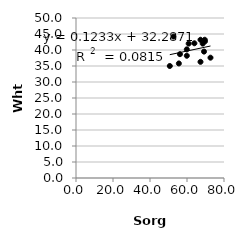
| Category | Series 0 |
|---|---|
| 59.9 | 38.2 |
| 72.7 | 37.6 |
| 55.6 | 35.8 |
| 67.3 | 36.3 |
| 69.2 | 39.5 |
| 67.3 | 43.2 |
| 69.7 | 42.7 |
| 60.9 | 42 |
| 59.9 | 40.2 |
| 50.7 | 35 |
| 52.7 | 44.2 |
| 69.6 | 43.2 |
| 68.5 | 42 |
| 56.2 | 38.7 |
| 64.0 | 42.1 |